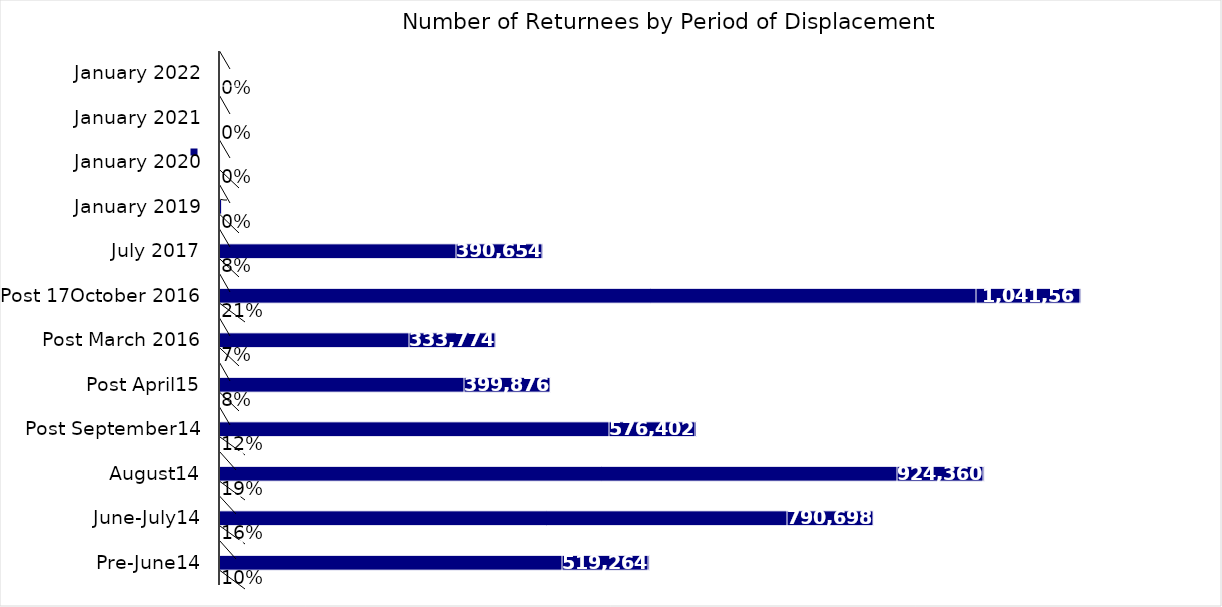
| Category | Sum of % | Sum of Returnees Individuals  | Sum of rank |
|---|---|---|---|
| Pre-June14 | 0.104 | 519264 | 12 |
| June-July14 | 0.159 | 790698 | 11 |
| August14 | 0.186 | 924360 | 10 |
| Post September14 | 0.116 | 576402 | 9 |
| Post April15 | 0.08 | 399876 | 8 |
| Post March 2016 | 0.067 | 333774 | 7 |
| Post 17October 2016 | 0.209 | 1041564 | 6 |
| July 2017 | 0.078 | 390654 | 5 |
| January 2019 | 0 | 2028 | 4 |
| January 2020 | 0 | 54 | 3 |
| January 2021 | 0 | 0 | 2 |
| January 2022 | 0 | 0 | 1 |